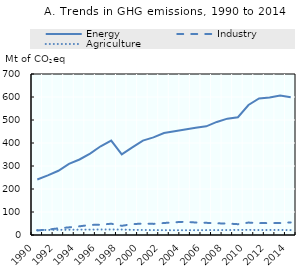
| Category | Energy | Industry | Agriculture |
|---|---|---|---|
| 1990.0 | 241.4 | 19.7 | 21.6 |
| 1991.0 | 259.3 | 23.4 | 21.9 |
| 1992.0 | 279.2 | 29 | 22.3 |
| 1993.0 | 309.2 | 33.2 | 22.8 |
| 1994.0 | 328.3 | 37.8 | 23.2 |
| 1995.0 | 354.1 | 43.8 | 23.4 |
| 1996.0 | 385.8 | 44.5 | 24 |
| 1997.0 | 410.2 | 49.1 | 23.9 |
| 1998.0 | 350.4 | 39.9 | 23.6 |
| 1999.0 | 381.1 | 47.3 | 22.4 |
| 2000.0 | 410.4 | 49.6 | 21.8 |
| 2001.0 | 424.4 | 48.3 | 21.3 |
| 2002.0 | 443.2 | 52.1 | 21.1 |
| 2003.0 | 450.8 | 55.3 | 20.8 |
| 2004.0 | 458.4 | 57.6 | 20.9 |
| 2005.0 | 466.4 | 54.3 | 21.1 |
| 2006.0 | 472.6 | 52.9 | 21.2 |
| 2007.0 | 491.6 | 50.8 | 21.4 |
| 2008.0 | 505.8 | 50 | 21.5 |
| 2009.0 | 512.2 | 47 | 22 |
| 2010.0 | 565.2 | 54 | 22.4 |
| 2011.0 | 593.9 | 51.7 | 21.5 |
| 2012.0 | 597.7 | 51.7 | 21.9 |
| 2013.0 | 606.7 | 52 | 21.9 |
| 2014.0 | 599.3 | 54.6 | 21.3 |